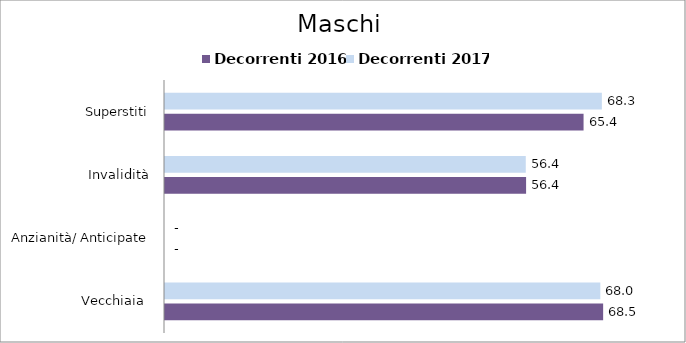
| Category | Decorrenti 2016 | Decorrenti 2017 |
|---|---|---|
| Vecchiaia  | 68.46 | 68.02 |
| Anzianità/ Anticipate | 0 | 0 |
| Invalidità | 56.42 | 56.37 |
| Superstiti | 65.4 | 68.26 |